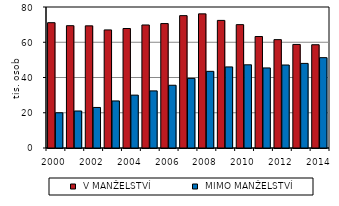
| Category |  V MANŽELSTVÍ |  MIMO MANŽELSTVÍ |
|---|---|---|
| 2000.0 | 71.1 | 20 |
| 2001.0 | 69.4 | 21 |
| 2002.0 | 69.3 | 23 |
| 2003.0 | 67 | 26.7 |
| 2004.0 | 67.8 | 30 |
| 2005.0 | 69.8 | 32.4 |
| 2006.0 | 70.6 | 35.6 |
| 2007.0 | 75.1 | 39.5 |
| 2008.0 | 76.1 | 43.5 |
| 2009.0 | 72.4 | 46 |
| 2010.0 | 70 | 47.2 |
| 2011.0 | 63.252 | 45.421 |
| 2012.0 | 61.488 | 47.088 |
| 2013.0 | 58.751 | 48 |
| 2014.0 | 58.593 | 51.267 |